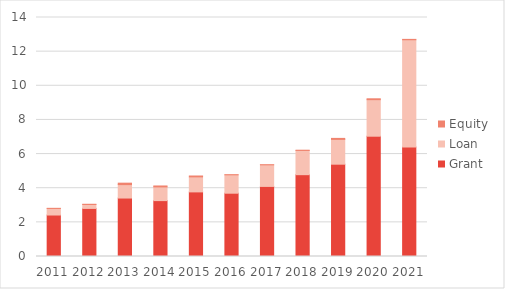
| Category | Grant | Loan | Equity |
|---|---|---|---|
| 2011.0 | 2.43 | 0.385 | 0.005 |
| 2012.0 | 2.816 | 0.231 | 0.012 |
| 2013.0 | 3.425 | 0.786 | 0.085 |
| 2014.0 | 3.274 | 0.803 | 0.055 |
| 2015.0 | 3.784 | 0.88 | 0.051 |
| 2016.0 | 3.707 | 1.078 | 0.006 |
| 2017.0 | 4.105 | 1.264 | 0.005 |
| 2018.0 | 4.793 | 1.42 | 0.012 |
| 2019.0 | 5.407 | 1.453 | 0.058 |
| 2020.0 | 7.047 | 2.141 | 0.052 |
| 2021.0 | 6.421 | 6.275 | 0.022 |